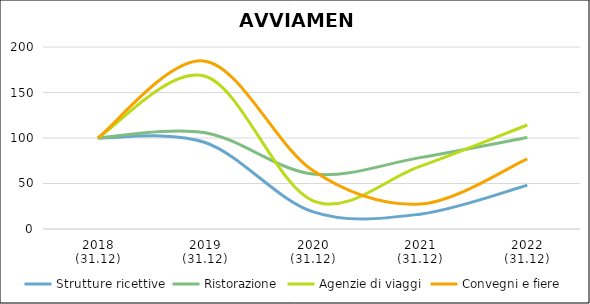
| Category | Strutture ricettive | Ristorazione | Agenzie di viaggi | Convegni e fiere |
|---|---|---|---|---|
| 2018
(31.12) | 100 | 100 | 100 | 100 |
| 2019
(31.12) | 95.038 | 105.795 | 167.857 | 184.444 |
| 2020
(31.12) | 19.107 | 60.438 | 31.25 | 64.444 |
| 2021
(31.12) | 16.301 | 78.413 | 68.75 | 27.407 |
| 2022
(31.12) | 48.02 | 100.499 | 114.286 | 77.037 |